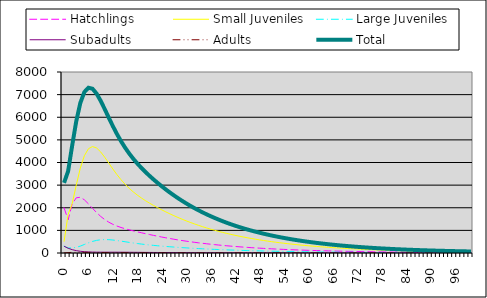
| Category | Hatchlings | Small Juveniles | Large Juveniles | Subadults | Adults | Total |
|---|---|---|---|---|---|---|
| 0.0 | 2000 | 500 | 300 | 300 | 1 | 3101 |
| 1.0 | 1461.396 | 1701.5 | 220.6 | 210.3 | 19.109 | 3612.905 |
| 2.0 | 2163.826 | 2182.597 | 224.905 | 147.616 | 28.289 | 4747.233 |
| 3.0 | 2439.634 | 2994.948 | 250.344 | 104.947 | 31.894 | 5821.768 |
| 4.0 | 2463.665 | 3752.202 | 305.239 | 76.331 | 32.207 | 6629.643 |
| 5.0 | 2349.56 | 4300.771 | 376.895 | 57.857 | 30.715 | 7115.798 |
| 6.0 | 2171.024 | 4609.395 | 449.757 | 46.619 | 28.381 | 7305.175 |
| 7.0 | 1974.125 | 4705.846 | 512.132 | 40.34 | 25.807 | 7258.249 |
| 8.0 | 1785.506 | 4640.744 | 557.645 | 37.242 | 23.341 | 7044.478 |
| 9.0 | 1618.437 | 4467.66 | 584.488 | 35.995 | 21.157 | 6727.736 |
| 10.0 | 1477.436 | 4233.21 | 593.989 | 35.654 | 19.314 | 6359.602 |
| 11.0 | 1361.761 | 3973.216 | 589.211 | 35.601 | 17.802 | 5977.591 |
| 12.0 | 1267.925 | 3712.359 | 573.853 | 35.475 | 16.575 | 5606.187 |
| 13.0 | 1191.413 | 3465.638 | 551.502 | 35.097 | 15.575 | 5259.225 |
| 14.0 | 1127.744 | 3240.547 | 525.222 | 34.415 | 14.742 | 4942.67 |
| 15.0 | 1073.045 | 3039.331 | 497.377 | 33.45 | 14.027 | 4657.231 |
| 16.0 | 1024.287 | 2860.955 | 469.625 | 32.263 | 13.39 | 4400.521 |
| 17.0 | 979.299 | 2702.646 | 443.009 | 30.926 | 12.802 | 4168.682 |
| 18.0 | 936.661 | 2560.987 | 418.081 | 29.509 | 12.245 | 3957.482 |
| 19.0 | 895.549 | 2432.62 | 395.046 | 28.069 | 11.707 | 3762.99 |
| 20.0 | 855.564 | 2314.627 | 373.878 | 26.649 | 11.184 | 3581.903 |
| 21.0 | 816.587 | 2204.689 | 354.425 | 25.278 | 10.675 | 3411.655 |
| 22.0 | 778.655 | 2101.093 | 336.478 | 23.974 | 10.179 | 3250.378 |
| 23.0 | 741.878 | 2002.66 | 319.817 | 22.743 | 9.698 | 3096.797 |
| 24.0 | 706.379 | 1908.638 | 304.245 | 21.587 | 9.234 | 2950.083 |
| 25.0 | 672.264 | 1818.578 | 289.595 | 20.503 | 8.788 | 2809.728 |
| 26.0 | 639.602 | 1732.238 | 275.737 | 19.486 | 8.361 | 2675.424 |
| 27.0 | 608.427 | 1649.495 | 262.574 | 18.528 | 7.954 | 2546.978 |
| 28.0 | 578.735 | 1570.283 | 250.038 | 17.625 | 7.566 | 2424.247 |
| 29.0 | 550.498 | 1494.555 | 238.078 | 16.771 | 7.196 | 2307.099 |
| 30.0 | 523.666 | 1422.258 | 226.661 | 15.961 | 6.846 | 2195.393 |
| 31.0 | 498.178 | 1353.322 | 215.763 | 15.192 | 6.512 | 2088.968 |
| 32.0 | 473.967 | 1287.656 | 205.362 | 14.461 | 6.196 | 1987.641 |
| 33.0 | 450.963 | 1225.149 | 195.443 | 13.764 | 5.895 | 1891.215 |
| 34.0 | 429.101 | 1165.68 | 185.988 | 13.1 | 5.609 | 1799.479 |
| 35.0 | 408.316 | 1109.116 | 176.981 | 12.468 | 5.338 | 1712.219 |
| 36.0 | 388.548 | 1055.322 | 168.405 | 11.866 | 5.079 | 1629.221 |
| 37.0 | 369.744 | 1004.161 | 160.242 | 11.292 | 4.834 | 1550.274 |
| 38.0 | 351.853 | 955.503 | 152.475 | 10.746 | 4.6 | 1475.176 |
| 39.0 | 334.828 | 909.22 | 145.085 | 10.226 | 4.377 | 1403.735 |
| 40.0 | 318.625 | 865.19 | 138.054 | 9.731 | 4.165 | 1335.765 |
| 41.0 | 303.205 | 823.301 | 131.365 | 9.259 | 3.964 | 1271.094 |
| 42.0 | 288.53 | 783.444 | 125.002 | 8.811 | 3.772 | 1209.558 |
| 43.0 | 274.563 | 745.519 | 118.948 | 8.384 | 3.589 | 1151.003 |
| 44.0 | 261.271 | 709.429 | 113.188 | 7.978 | 3.415 | 1095.282 |
| 45.0 | 248.621 | 675.087 | 107.708 | 7.592 | 3.25 | 1042.257 |
| 46.0 | 236.583 | 642.405 | 102.493 | 7.224 | 3.093 | 991.798 |
| 47.0 | 225.128 | 611.304 | 97.531 | 6.874 | 2.943 | 943.78 |
| 48.0 | 214.227 | 581.708 | 92.809 | 6.541 | 2.8 | 898.086 |
| 49.0 | 203.854 | 553.544 | 88.316 | 6.224 | 2.665 | 854.604 |
| 50.0 | 193.983 | 526.743 | 84.04 | 5.923 | 2.536 | 813.226 |
| 51.0 | 184.591 | 501.239 | 79.971 | 5.636 | 2.413 | 773.85 |
| 52.0 | 175.653 | 476.97 | 76.099 | 5.363 | 2.296 | 736.382 |
| 53.0 | 167.148 | 453.875 | 72.415 | 5.104 | 2.185 | 700.727 |
| 54.0 | 159.055 | 431.899 | 68.909 | 4.857 | 2.079 | 666.798 |
| 55.0 | 151.353 | 410.987 | 65.572 | 4.621 | 1.979 | 634.513 |
| 56.0 | 144.025 | 391.087 | 62.397 | 4.398 | 1.883 | 603.791 |
| 57.0 | 137.052 | 372.152 | 59.376 | 4.185 | 1.792 | 574.556 |
| 58.0 | 130.416 | 354.132 | 56.501 | 3.982 | 1.705 | 546.737 |
| 59.0 | 124.101 | 336.986 | 53.766 | 3.789 | 1.622 | 520.265 |
| 60.0 | 118.093 | 320.67 | 51.162 | 3.606 | 1.544 | 495.074 |
| 61.0 | 112.375 | 305.143 | 48.685 | 3.431 | 1.469 | 471.104 |
| 62.0 | 106.934 | 290.369 | 46.328 | 3.265 | 1.398 | 448.294 |
| 63.0 | 101.756 | 276.31 | 44.085 | 3.107 | 1.33 | 426.588 |
| 64.0 | 96.83 | 262.931 | 41.95 | 2.957 | 1.266 | 405.933 |
| 65.0 | 92.141 | 250.201 | 39.919 | 2.813 | 1.205 | 386.279 |
| 66.0 | 87.68 | 238.086 | 37.986 | 2.677 | 1.146 | 367.576 |
| 67.0 | 83.435 | 226.559 | 36.147 | 2.548 | 1.091 | 349.779 |
| 68.0 | 79.395 | 215.589 | 34.397 | 2.424 | 1.038 | 332.843 |
| 69.0 | 75.551 | 205.151 | 32.731 | 2.307 | 0.988 | 316.727 |
| 70.0 | 71.893 | 195.218 | 31.147 | 2.195 | 0.94 | 301.392 |
| 71.0 | 68.412 | 185.765 | 29.639 | 2.089 | 0.894 | 286.799 |
| 72.0 | 65.099 | 176.771 | 28.204 | 1.988 | 0.851 | 272.913 |
| 73.0 | 61.947 | 168.212 | 26.838 | 1.892 | 0.81 | 259.699 |
| 74.0 | 58.948 | 160.068 | 25.538 | 1.8 | 0.771 | 247.125 |
| 75.0 | 56.094 | 152.317 | 24.302 | 1.713 | 0.733 | 235.159 |
| 76.0 | 53.378 | 144.942 | 23.125 | 1.63 | 0.698 | 223.773 |
| 77.0 | 50.793 | 137.925 | 22.006 | 1.551 | 0.664 | 212.939 |
| 78.0 | 48.334 | 131.246 | 20.94 | 1.476 | 0.632 | 202.628 |
| 79.0 | 45.994 | 124.892 | 19.926 | 1.404 | 0.601 | 192.817 |
| 80.0 | 43.767 | 118.845 | 18.961 | 1.336 | 0.572 | 183.482 |
| 81.0 | 41.648 | 113.09 | 18.043 | 1.272 | 0.544 | 174.598 |
| 82.0 | 39.631 | 107.615 | 17.17 | 1.21 | 0.518 | 166.144 |
| 83.0 | 37.712 | 102.404 | 16.338 | 1.152 | 0.493 | 158.1 |
| 84.0 | 35.886 | 97.446 | 15.547 | 1.096 | 0.469 | 150.445 |
| 85.0 | 34.149 | 92.728 | 14.795 | 1.043 | 0.446 | 143.16 |
| 86.0 | 32.495 | 88.238 | 14.078 | 0.992 | 0.425 | 136.229 |
| 87.0 | 30.922 | 83.966 | 13.397 | 0.944 | 0.404 | 129.633 |
| 88.0 | 29.425 | 79.9 | 12.748 | 0.898 | 0.385 | 123.356 |
| 89.0 | 28 | 76.032 | 12.131 | 0.855 | 0.366 | 117.384 |
| 90.0 | 26.644 | 72.35 | 11.543 | 0.814 | 0.348 | 111.7 |
| 91.0 | 25.354 | 68.847 | 10.984 | 0.774 | 0.331 | 106.292 |
| 92.0 | 24.127 | 65.514 | 10.453 | 0.737 | 0.315 | 101.145 |
| 93.0 | 22.959 | 62.342 | 9.947 | 0.701 | 0.3 | 96.248 |
| 94.0 | 21.847 | 59.323 | 9.465 | 0.667 | 0.286 | 91.588 |
| 95.0 | 20.789 | 56.451 | 9.007 | 0.635 | 0.272 | 87.153 |
| 96.0 | 19.783 | 53.718 | 8.571 | 0.604 | 0.259 | 82.934 |
| 97.0 | 18.825 | 51.117 | 8.156 | 0.575 | 0.246 | 78.918 |
| 98.0 | 17.913 | 48.642 | 7.761 | 0.547 | 0.234 | 75.097 |
| 99.0 | 17.046 | 46.287 | 7.385 | 0.52 | 0.223 | 71.461 |
| 100.0 | 16.221 | 44.046 | 7.027 | 0.495 | 0.212 | 68.001 |